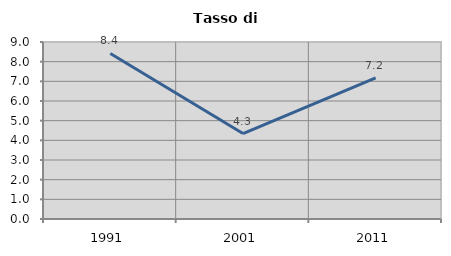
| Category | Tasso di disoccupazione   |
|---|---|
| 1991.0 | 8.417 |
| 2001.0 | 4.345 |
| 2011.0 | 7.177 |